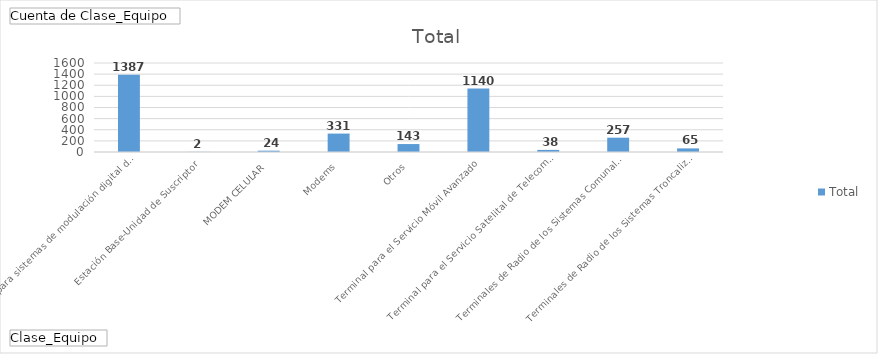
| Category | Total |
|---|---|
| Equipos para sistemas de modulación digital de banda ancha | 1387 |
| Estación Base-Unidad de Suscriptor | 2 |
| MODEM CELULAR | 24 |
| Modems | 331 |
| Otros | 143 |
| Terminal para el Servicio Móvil Avanzado | 1140 |
| Terminal para el Servicio Satelital de Telecomunicaciones | 38 |
| Terminales de Radio de los Sistemas Comunales de Explotación | 257 |
| Terminales de Radio de los Sistemas Troncalizados | 65 |